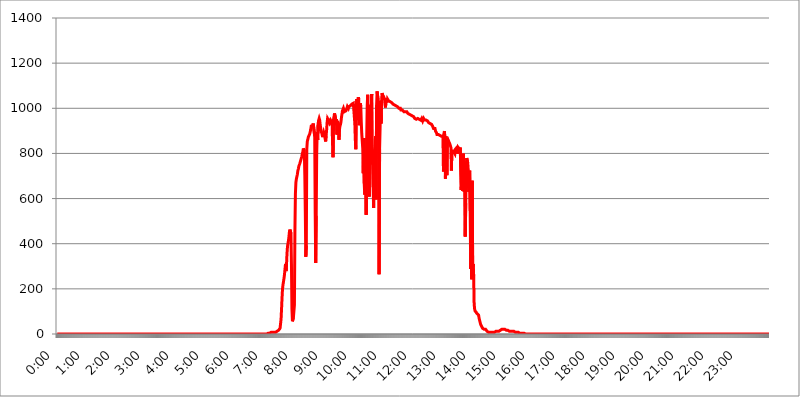
| Category | 2016.12.11. Intenzitás [W/m^2] |
|---|---|
| 0.0 | 0 |
| 0.0006944444444444445 | 0 |
| 0.001388888888888889 | 0 |
| 0.0020833333333333333 | 0 |
| 0.002777777777777778 | 0 |
| 0.003472222222222222 | 0 |
| 0.004166666666666667 | 0 |
| 0.004861111111111111 | 0 |
| 0.005555555555555556 | 0 |
| 0.0062499999999999995 | 0 |
| 0.006944444444444444 | 0 |
| 0.007638888888888889 | 0 |
| 0.008333333333333333 | 0 |
| 0.009027777777777779 | 0 |
| 0.009722222222222222 | 0 |
| 0.010416666666666666 | 0 |
| 0.011111111111111112 | 0 |
| 0.011805555555555555 | 0 |
| 0.012499999999999999 | 0 |
| 0.013194444444444444 | 0 |
| 0.013888888888888888 | 0 |
| 0.014583333333333332 | 0 |
| 0.015277777777777777 | 0 |
| 0.015972222222222224 | 0 |
| 0.016666666666666666 | 0 |
| 0.017361111111111112 | 0 |
| 0.018055555555555557 | 0 |
| 0.01875 | 0 |
| 0.019444444444444445 | 0 |
| 0.02013888888888889 | 0 |
| 0.020833333333333332 | 0 |
| 0.02152777777777778 | 0 |
| 0.022222222222222223 | 0 |
| 0.02291666666666667 | 0 |
| 0.02361111111111111 | 0 |
| 0.024305555555555556 | 0 |
| 0.024999999999999998 | 0 |
| 0.025694444444444447 | 0 |
| 0.02638888888888889 | 0 |
| 0.027083333333333334 | 0 |
| 0.027777777777777776 | 0 |
| 0.02847222222222222 | 0 |
| 0.029166666666666664 | 0 |
| 0.029861111111111113 | 0 |
| 0.030555555555555555 | 0 |
| 0.03125 | 0 |
| 0.03194444444444445 | 0 |
| 0.03263888888888889 | 0 |
| 0.03333333333333333 | 0 |
| 0.034027777777777775 | 0 |
| 0.034722222222222224 | 0 |
| 0.035416666666666666 | 0 |
| 0.036111111111111115 | 0 |
| 0.03680555555555556 | 0 |
| 0.0375 | 0 |
| 0.03819444444444444 | 0 |
| 0.03888888888888889 | 0 |
| 0.03958333333333333 | 0 |
| 0.04027777777777778 | 0 |
| 0.04097222222222222 | 0 |
| 0.041666666666666664 | 0 |
| 0.042361111111111106 | 0 |
| 0.04305555555555556 | 0 |
| 0.043750000000000004 | 0 |
| 0.044444444444444446 | 0 |
| 0.04513888888888889 | 0 |
| 0.04583333333333334 | 0 |
| 0.04652777777777778 | 0 |
| 0.04722222222222222 | 0 |
| 0.04791666666666666 | 0 |
| 0.04861111111111111 | 0 |
| 0.049305555555555554 | 0 |
| 0.049999999999999996 | 0 |
| 0.05069444444444445 | 0 |
| 0.051388888888888894 | 0 |
| 0.052083333333333336 | 0 |
| 0.05277777777777778 | 0 |
| 0.05347222222222222 | 0 |
| 0.05416666666666667 | 0 |
| 0.05486111111111111 | 0 |
| 0.05555555555555555 | 0 |
| 0.05625 | 0 |
| 0.05694444444444444 | 0 |
| 0.057638888888888885 | 0 |
| 0.05833333333333333 | 0 |
| 0.05902777777777778 | 0 |
| 0.059722222222222225 | 0 |
| 0.06041666666666667 | 0 |
| 0.061111111111111116 | 0 |
| 0.06180555555555556 | 0 |
| 0.0625 | 0 |
| 0.06319444444444444 | 0 |
| 0.06388888888888888 | 0 |
| 0.06458333333333334 | 0 |
| 0.06527777777777778 | 0 |
| 0.06597222222222222 | 0 |
| 0.06666666666666667 | 0 |
| 0.06736111111111111 | 0 |
| 0.06805555555555555 | 0 |
| 0.06874999999999999 | 0 |
| 0.06944444444444443 | 0 |
| 0.07013888888888889 | 0 |
| 0.07083333333333333 | 0 |
| 0.07152777777777779 | 0 |
| 0.07222222222222223 | 0 |
| 0.07291666666666667 | 0 |
| 0.07361111111111111 | 0 |
| 0.07430555555555556 | 0 |
| 0.075 | 0 |
| 0.07569444444444444 | 0 |
| 0.0763888888888889 | 0 |
| 0.07708333333333334 | 0 |
| 0.07777777777777778 | 0 |
| 0.07847222222222222 | 0 |
| 0.07916666666666666 | 0 |
| 0.0798611111111111 | 0 |
| 0.08055555555555556 | 0 |
| 0.08125 | 0 |
| 0.08194444444444444 | 0 |
| 0.08263888888888889 | 0 |
| 0.08333333333333333 | 0 |
| 0.08402777777777777 | 0 |
| 0.08472222222222221 | 0 |
| 0.08541666666666665 | 0 |
| 0.08611111111111112 | 0 |
| 0.08680555555555557 | 0 |
| 0.08750000000000001 | 0 |
| 0.08819444444444445 | 0 |
| 0.08888888888888889 | 0 |
| 0.08958333333333333 | 0 |
| 0.09027777777777778 | 0 |
| 0.09097222222222222 | 0 |
| 0.09166666666666667 | 0 |
| 0.09236111111111112 | 0 |
| 0.09305555555555556 | 0 |
| 0.09375 | 0 |
| 0.09444444444444444 | 0 |
| 0.09513888888888888 | 0 |
| 0.09583333333333333 | 0 |
| 0.09652777777777777 | 0 |
| 0.09722222222222222 | 0 |
| 0.09791666666666667 | 0 |
| 0.09861111111111111 | 0 |
| 0.09930555555555555 | 0 |
| 0.09999999999999999 | 0 |
| 0.10069444444444443 | 0 |
| 0.1013888888888889 | 0 |
| 0.10208333333333335 | 0 |
| 0.10277777777777779 | 0 |
| 0.10347222222222223 | 0 |
| 0.10416666666666667 | 0 |
| 0.10486111111111111 | 0 |
| 0.10555555555555556 | 0 |
| 0.10625 | 0 |
| 0.10694444444444444 | 0 |
| 0.1076388888888889 | 0 |
| 0.10833333333333334 | 0 |
| 0.10902777777777778 | 0 |
| 0.10972222222222222 | 0 |
| 0.1111111111111111 | 0 |
| 0.11180555555555556 | 0 |
| 0.11180555555555556 | 0 |
| 0.1125 | 0 |
| 0.11319444444444444 | 0 |
| 0.11388888888888889 | 0 |
| 0.11458333333333333 | 0 |
| 0.11527777777777777 | 0 |
| 0.11597222222222221 | 0 |
| 0.11666666666666665 | 0 |
| 0.1173611111111111 | 0 |
| 0.11805555555555557 | 0 |
| 0.11944444444444445 | 0 |
| 0.12013888888888889 | 0 |
| 0.12083333333333333 | 0 |
| 0.12152777777777778 | 0 |
| 0.12222222222222223 | 0 |
| 0.12291666666666667 | 0 |
| 0.12291666666666667 | 0 |
| 0.12361111111111112 | 0 |
| 0.12430555555555556 | 0 |
| 0.125 | 0 |
| 0.12569444444444444 | 0 |
| 0.12638888888888888 | 0 |
| 0.12708333333333333 | 0 |
| 0.16875 | 0 |
| 0.12847222222222224 | 0 |
| 0.12916666666666668 | 0 |
| 0.12986111111111112 | 0 |
| 0.13055555555555556 | 0 |
| 0.13125 | 0 |
| 0.13194444444444445 | 0 |
| 0.1326388888888889 | 0 |
| 0.13333333333333333 | 0 |
| 0.13402777777777777 | 0 |
| 0.13402777777777777 | 0 |
| 0.13472222222222222 | 0 |
| 0.13541666666666666 | 0 |
| 0.1361111111111111 | 0 |
| 0.13749999999999998 | 0 |
| 0.13819444444444443 | 0 |
| 0.1388888888888889 | 0 |
| 0.13958333333333334 | 0 |
| 0.14027777777777778 | 0 |
| 0.14097222222222222 | 0 |
| 0.14166666666666666 | 0 |
| 0.1423611111111111 | 0 |
| 0.14305555555555557 | 0 |
| 0.14375000000000002 | 0 |
| 0.14444444444444446 | 0 |
| 0.1451388888888889 | 0 |
| 0.1451388888888889 | 0 |
| 0.14652777777777778 | 0 |
| 0.14722222222222223 | 0 |
| 0.14791666666666667 | 0 |
| 0.1486111111111111 | 0 |
| 0.14930555555555555 | 0 |
| 0.15 | 0 |
| 0.15069444444444444 | 0 |
| 0.15138888888888888 | 0 |
| 0.15208333333333332 | 0 |
| 0.15277777777777776 | 0 |
| 0.15347222222222223 | 0 |
| 0.15416666666666667 | 0 |
| 0.15486111111111112 | 0 |
| 0.15555555555555556 | 0 |
| 0.15625 | 0 |
| 0.15694444444444444 | 0 |
| 0.15763888888888888 | 0 |
| 0.15833333333333333 | 0 |
| 0.15902777777777777 | 0 |
| 0.15972222222222224 | 0 |
| 0.16041666666666668 | 0 |
| 0.16111111111111112 | 0 |
| 0.16180555555555556 | 0 |
| 0.1625 | 0 |
| 0.16319444444444445 | 0 |
| 0.1638888888888889 | 0 |
| 0.16458333333333333 | 0 |
| 0.16527777777777777 | 0 |
| 0.16597222222222222 | 0 |
| 0.16666666666666666 | 0 |
| 0.1673611111111111 | 0 |
| 0.16805555555555554 | 0 |
| 0.16874999999999998 | 0 |
| 0.16944444444444443 | 0 |
| 0.17013888888888887 | 0 |
| 0.1708333333333333 | 0 |
| 0.17152777777777775 | 0 |
| 0.17222222222222225 | 0 |
| 0.1729166666666667 | 0 |
| 0.17361111111111113 | 0 |
| 0.17430555555555557 | 0 |
| 0.17500000000000002 | 0 |
| 0.17569444444444446 | 0 |
| 0.1763888888888889 | 0 |
| 0.17708333333333334 | 0 |
| 0.17777777777777778 | 0 |
| 0.17847222222222223 | 0 |
| 0.17916666666666667 | 0 |
| 0.1798611111111111 | 0 |
| 0.18055555555555555 | 0 |
| 0.18125 | 0 |
| 0.18194444444444444 | 0 |
| 0.1826388888888889 | 0 |
| 0.18333333333333335 | 0 |
| 0.1840277777777778 | 0 |
| 0.18472222222222223 | 0 |
| 0.18541666666666667 | 0 |
| 0.18611111111111112 | 0 |
| 0.18680555555555556 | 0 |
| 0.1875 | 0 |
| 0.18819444444444444 | 0 |
| 0.18888888888888888 | 0 |
| 0.18958333333333333 | 0 |
| 0.19027777777777777 | 0 |
| 0.1909722222222222 | 0 |
| 0.19166666666666665 | 0 |
| 0.19236111111111112 | 0 |
| 0.19305555555555554 | 0 |
| 0.19375 | 0 |
| 0.19444444444444445 | 0 |
| 0.1951388888888889 | 0 |
| 0.19583333333333333 | 0 |
| 0.19652777777777777 | 0 |
| 0.19722222222222222 | 0 |
| 0.19791666666666666 | 0 |
| 0.1986111111111111 | 0 |
| 0.19930555555555554 | 0 |
| 0.19999999999999998 | 0 |
| 0.20069444444444443 | 0 |
| 0.20138888888888887 | 0 |
| 0.2020833333333333 | 0 |
| 0.2027777777777778 | 0 |
| 0.2034722222222222 | 0 |
| 0.2041666666666667 | 0 |
| 0.20486111111111113 | 0 |
| 0.20555555555555557 | 0 |
| 0.20625000000000002 | 0 |
| 0.20694444444444446 | 0 |
| 0.2076388888888889 | 0 |
| 0.20833333333333334 | 0 |
| 0.20902777777777778 | 0 |
| 0.20972222222222223 | 0 |
| 0.21041666666666667 | 0 |
| 0.2111111111111111 | 0 |
| 0.21180555555555555 | 0 |
| 0.2125 | 0 |
| 0.21319444444444444 | 0 |
| 0.2138888888888889 | 0 |
| 0.21458333333333335 | 0 |
| 0.2152777777777778 | 0 |
| 0.21597222222222223 | 0 |
| 0.21666666666666667 | 0 |
| 0.21736111111111112 | 0 |
| 0.21805555555555556 | 0 |
| 0.21875 | 0 |
| 0.21944444444444444 | 0 |
| 0.22013888888888888 | 0 |
| 0.22083333333333333 | 0 |
| 0.22152777777777777 | 0 |
| 0.2222222222222222 | 0 |
| 0.22291666666666665 | 0 |
| 0.2236111111111111 | 0 |
| 0.22430555555555556 | 0 |
| 0.225 | 0 |
| 0.22569444444444445 | 0 |
| 0.2263888888888889 | 0 |
| 0.22708333333333333 | 0 |
| 0.22777777777777777 | 0 |
| 0.22847222222222222 | 0 |
| 0.22916666666666666 | 0 |
| 0.2298611111111111 | 0 |
| 0.23055555555555554 | 0 |
| 0.23124999999999998 | 0 |
| 0.23194444444444443 | 0 |
| 0.23263888888888887 | 0 |
| 0.2333333333333333 | 0 |
| 0.2340277777777778 | 0 |
| 0.2347222222222222 | 0 |
| 0.2354166666666667 | 0 |
| 0.23611111111111113 | 0 |
| 0.23680555555555557 | 0 |
| 0.23750000000000002 | 0 |
| 0.23819444444444446 | 0 |
| 0.2388888888888889 | 0 |
| 0.23958333333333334 | 0 |
| 0.24027777777777778 | 0 |
| 0.24097222222222223 | 0 |
| 0.24166666666666667 | 0 |
| 0.2423611111111111 | 0 |
| 0.24305555555555555 | 0 |
| 0.24375 | 0 |
| 0.24444444444444446 | 0 |
| 0.24513888888888888 | 0 |
| 0.24583333333333335 | 0 |
| 0.2465277777777778 | 0 |
| 0.24722222222222223 | 0 |
| 0.24791666666666667 | 0 |
| 0.24861111111111112 | 0 |
| 0.24930555555555556 | 0 |
| 0.25 | 0 |
| 0.25069444444444444 | 0 |
| 0.2513888888888889 | 0 |
| 0.2520833333333333 | 0 |
| 0.25277777777777777 | 0 |
| 0.2534722222222222 | 0 |
| 0.25416666666666665 | 0 |
| 0.2548611111111111 | 0 |
| 0.2555555555555556 | 0 |
| 0.25625000000000003 | 0 |
| 0.2569444444444445 | 0 |
| 0.2576388888888889 | 0 |
| 0.25833333333333336 | 0 |
| 0.2590277777777778 | 0 |
| 0.25972222222222224 | 0 |
| 0.2604166666666667 | 0 |
| 0.2611111111111111 | 0 |
| 0.26180555555555557 | 0 |
| 0.2625 | 0 |
| 0.26319444444444445 | 0 |
| 0.2638888888888889 | 0 |
| 0.26458333333333334 | 0 |
| 0.2652777777777778 | 0 |
| 0.2659722222222222 | 0 |
| 0.26666666666666666 | 0 |
| 0.2673611111111111 | 0 |
| 0.26805555555555555 | 0 |
| 0.26875 | 0 |
| 0.26944444444444443 | 0 |
| 0.2701388888888889 | 0 |
| 0.2708333333333333 | 0 |
| 0.27152777777777776 | 0 |
| 0.2722222222222222 | 0 |
| 0.27291666666666664 | 0 |
| 0.2736111111111111 | 0 |
| 0.2743055555555555 | 0 |
| 0.27499999999999997 | 0 |
| 0.27569444444444446 | 0 |
| 0.27638888888888885 | 0 |
| 0.27708333333333335 | 0 |
| 0.2777777777777778 | 0 |
| 0.27847222222222223 | 0 |
| 0.2791666666666667 | 0 |
| 0.2798611111111111 | 0 |
| 0.28055555555555556 | 0 |
| 0.28125 | 0 |
| 0.28194444444444444 | 0 |
| 0.2826388888888889 | 0 |
| 0.2833333333333333 | 0 |
| 0.28402777777777777 | 0 |
| 0.2847222222222222 | 0 |
| 0.28541666666666665 | 0 |
| 0.28611111111111115 | 0 |
| 0.28680555555555554 | 0 |
| 0.28750000000000003 | 0 |
| 0.2881944444444445 | 0 |
| 0.2888888888888889 | 0 |
| 0.28958333333333336 | 0 |
| 0.2902777777777778 | 0 |
| 0.29097222222222224 | 0 |
| 0.2916666666666667 | 0 |
| 0.2923611111111111 | 0 |
| 0.29305555555555557 | 0 |
| 0.29375 | 0 |
| 0.29444444444444445 | 3.525 |
| 0.2951388888888889 | 3.525 |
| 0.29583333333333334 | 3.525 |
| 0.2965277777777778 | 3.525 |
| 0.2972222222222222 | 3.525 |
| 0.29791666666666666 | 3.525 |
| 0.2986111111111111 | 3.525 |
| 0.29930555555555555 | 7.887 |
| 0.3 | 7.887 |
| 0.30069444444444443 | 7.887 |
| 0.3013888888888889 | 7.887 |
| 0.3020833333333333 | 7.887 |
| 0.30277777777777776 | 7.887 |
| 0.3034722222222222 | 7.887 |
| 0.30416666666666664 | 7.887 |
| 0.3048611111111111 | 7.887 |
| 0.3055555555555555 | 7.887 |
| 0.30624999999999997 | 7.887 |
| 0.3069444444444444 | 12.257 |
| 0.3076388888888889 | 12.257 |
| 0.30833333333333335 | 12.257 |
| 0.3090277777777778 | 12.257 |
| 0.30972222222222223 | 16.636 |
| 0.3104166666666667 | 16.636 |
| 0.3111111111111111 | 21.024 |
| 0.31180555555555556 | 21.024 |
| 0.3125 | 25.419 |
| 0.31319444444444444 | 29.823 |
| 0.3138888888888889 | 65.31 |
| 0.3145833333333333 | 110.201 |
| 0.31527777777777777 | 160.056 |
| 0.3159722222222222 | 201.058 |
| 0.31666666666666665 | 219.309 |
| 0.31736111111111115 | 233 |
| 0.31805555555555554 | 246.689 |
| 0.31875000000000003 | 264.932 |
| 0.3194444444444445 | 287.709 |
| 0.3201388888888889 | 310.44 |
| 0.32083333333333336 | 278.603 |
| 0.3215277777777778 | 305.898 |
| 0.32222222222222224 | 355.712 |
| 0.3229166666666667 | 387.202 |
| 0.3236111111111111 | 400.638 |
| 0.32430555555555557 | 414.035 |
| 0.325 | 431.833 |
| 0.32569444444444445 | 453.968 |
| 0.3263888888888889 | 462.786 |
| 0.32708333333333334 | 458.38 |
| 0.3277777777777778 | 445.129 |
| 0.3284722222222222 | 310.44 |
| 0.32916666666666666 | 110.201 |
| 0.3298611111111111 | 56.398 |
| 0.33055555555555555 | 56.398 |
| 0.33125 | 74.246 |
| 0.33194444444444443 | 74.246 |
| 0.3326388888888889 | 128.284 |
| 0.3333333333333333 | 453.968 |
| 0.3340277777777778 | 621.613 |
| 0.3347222222222222 | 671.22 |
| 0.3354166666666667 | 687.544 |
| 0.3361111111111111 | 683.473 |
| 0.3368055555555556 | 707.8 |
| 0.33749999999999997 | 723.889 |
| 0.33819444444444446 | 731.896 |
| 0.33888888888888885 | 743.859 |
| 0.33958333333333335 | 743.859 |
| 0.34027777777777773 | 755.766 |
| 0.34097222222222223 | 759.723 |
| 0.3416666666666666 | 771.559 |
| 0.3423611111111111 | 775.492 |
| 0.3430555555555555 | 787.258 |
| 0.34375 | 798.974 |
| 0.3444444444444445 | 806.757 |
| 0.3451388888888889 | 822.26 |
| 0.3458333333333334 | 818.392 |
| 0.34652777777777777 | 810.641 |
| 0.34722222222222227 | 703.762 |
| 0.34791666666666665 | 541.121 |
| 0.34861111111111115 | 342.162 |
| 0.34930555555555554 | 391.685 |
| 0.35000000000000003 | 818.392 |
| 0.3506944444444444 | 853.029 |
| 0.3513888888888889 | 860.676 |
| 0.3520833333333333 | 872.114 |
| 0.3527777777777778 | 872.114 |
| 0.3534722222222222 | 875.918 |
| 0.3541666666666667 | 887.309 |
| 0.3548611111111111 | 891.099 |
| 0.35555555555555557 | 906.223 |
| 0.35625 | 921.298 |
| 0.35694444444444445 | 925.06 |
| 0.3576388888888889 | 925.06 |
| 0.35833333333333334 | 925.06 |
| 0.3590277777777778 | 932.576 |
| 0.3597222222222222 | 932.576 |
| 0.36041666666666666 | 928.819 |
| 0.3611111111111111 | 875.918 |
| 0.36180555555555555 | 532.513 |
| 0.3625 | 314.98 |
| 0.36319444444444443 | 523.88 |
| 0.3638888888888889 | 798.974 |
| 0.3645833333333333 | 894.885 |
| 0.3652777777777778 | 860.676 |
| 0.3659722222222222 | 932.576 |
| 0.3666666666666667 | 947.58 |
| 0.3673611111111111 | 955.071 |
| 0.3680555555555556 | 947.58 |
| 0.36874999999999997 | 928.819 |
| 0.36944444444444446 | 913.766 |
| 0.37013888888888885 | 898.668 |
| 0.37083333333333335 | 894.885 |
| 0.37152777777777773 | 883.516 |
| 0.37222222222222223 | 872.114 |
| 0.3729166666666666 | 887.309 |
| 0.3736111111111111 | 894.885 |
| 0.3743055555555555 | 898.668 |
| 0.375 | 879.719 |
| 0.3756944444444445 | 879.719 |
| 0.3763888888888889 | 853.029 |
| 0.3770833333333334 | 879.719 |
| 0.37777777777777777 | 902.447 |
| 0.37847222222222227 | 936.33 |
| 0.37916666666666665 | 955.071 |
| 0.37986111111111115 | 955.071 |
| 0.38055555555555554 | 947.58 |
| 0.38125000000000003 | 947.58 |
| 0.3819444444444444 | 936.33 |
| 0.3826388888888889 | 940.082 |
| 0.3833333333333333 | 947.58 |
| 0.3840277777777778 | 951.327 |
| 0.3847222222222222 | 951.327 |
| 0.3854166666666667 | 936.33 |
| 0.3861111111111111 | 845.365 |
| 0.38680555555555557 | 783.342 |
| 0.3875 | 951.327 |
| 0.38819444444444445 | 962.555 |
| 0.3888888888888889 | 977.508 |
| 0.38958333333333334 | 981.244 |
| 0.3902777777777778 | 955.071 |
| 0.3909722222222222 | 925.06 |
| 0.39166666666666666 | 951.327 |
| 0.3923611111111111 | 883.516 |
| 0.39305555555555555 | 943.832 |
| 0.39375 | 932.576 |
| 0.39444444444444443 | 909.996 |
| 0.3951388888888889 | 860.676 |
| 0.3958333333333333 | 906.223 |
| 0.3965277777777778 | 921.298 |
| 0.3972222222222222 | 928.819 |
| 0.3979166666666667 | 940.082 |
| 0.3986111111111111 | 958.814 |
| 0.3993055555555556 | 973.772 |
| 0.39999999999999997 | 988.714 |
| 0.40069444444444446 | 992.448 |
| 0.40138888888888885 | 999.916 |
| 0.40208333333333335 | 992.448 |
| 0.40277777777777773 | 984.98 |
| 0.40347222222222223 | 981.244 |
| 0.4041666666666666 | 984.98 |
| 0.4048611111111111 | 988.714 |
| 0.4055555555555555 | 992.448 |
| 0.40625 | 999.916 |
| 0.4069444444444445 | 1007.383 |
| 0.4076388888888889 | 1003.65 |
| 0.4083333333333334 | 999.916 |
| 0.40902777777777777 | 1007.383 |
| 0.40972222222222227 | 1007.383 |
| 0.41041666666666665 | 1011.118 |
| 0.41111111111111115 | 1011.118 |
| 0.41180555555555554 | 1014.852 |
| 0.41250000000000003 | 1014.852 |
| 0.4131944444444444 | 1018.587 |
| 0.4138888888888889 | 1018.587 |
| 0.4145833333333333 | 1022.323 |
| 0.4152777777777778 | 1022.323 |
| 0.4159722222222222 | 1022.323 |
| 0.4166666666666667 | 1022.323 |
| 0.4173611111111111 | 932.576 |
| 0.41805555555555557 | 860.676 |
| 0.41875 | 818.392 |
| 0.41944444444444445 | 1011.118 |
| 0.4201388888888889 | 1041.019 |
| 0.42083333333333334 | 1037.277 |
| 0.4215277777777778 | 947.58 |
| 0.4222222222222222 | 1048.508 |
| 0.42291666666666666 | 1041.019 |
| 0.4236111111111111 | 925.06 |
| 0.42430555555555555 | 955.071 |
| 0.425 | 1022.323 |
| 0.42569444444444443 | 1011.118 |
| 0.4263888888888889 | 940.082 |
| 0.4270833333333333 | 887.309 |
| 0.4277777777777778 | 883.516 |
| 0.4284722222222222 | 822.26 |
| 0.4291666666666667 | 711.832 |
| 0.4298611111111111 | 868.305 |
| 0.4305555555555556 | 667.123 |
| 0.43124999999999997 | 617.436 |
| 0.43194444444444446 | 634.105 |
| 0.43263888888888885 | 743.859 |
| 0.43333333333333335 | 528.2 |
| 0.43402777777777773 | 868.305 |
| 0.43472222222222223 | 1011.118 |
| 0.4354166666666666 | 1059.756 |
| 0.4361111111111111 | 818.392 |
| 0.4368055555555555 | 883.516 |
| 0.4375 | 609.062 |
| 0.4381944444444445 | 751.803 |
| 0.4388888888888889 | 955.071 |
| 0.4395833333333334 | 1014.852 |
| 0.44027777777777777 | 984.98 |
| 0.44097222222222227 | 1063.51 |
| 0.44166666666666665 | 751.803 |
| 0.44236111111111115 | 814.519 |
| 0.44305555555555554 | 650.667 |
| 0.44375000000000003 | 558.261 |
| 0.4444444444444444 | 802.868 |
| 0.4451388888888889 | 814.519 |
| 0.4458333333333333 | 833.834 |
| 0.4465277777777778 | 875.918 |
| 0.4472222222222222 | 596.45 |
| 0.4479166666666667 | 1014.852 |
| 0.4486111111111111 | 1074.789 |
| 0.44930555555555557 | 1071.027 |
| 0.45 | 1037.277 |
| 0.45069444444444445 | 932.576 |
| 0.4513888888888889 | 264.932 |
| 0.45208333333333334 | 818.392 |
| 0.4527777777777778 | 909.996 |
| 0.4534722222222222 | 1033.537 |
| 0.45416666666666666 | 932.576 |
| 0.4548611111111111 | 1029.798 |
| 0.45555555555555555 | 1067.267 |
| 0.45625 | 1059.756 |
| 0.45694444444444443 | 1056.004 |
| 0.4576388888888889 | 1052.255 |
| 0.4583333333333333 | 1052.255 |
| 0.4590277777777778 | 1041.019 |
| 0.4597222222222222 | 1014.852 |
| 0.4604166666666667 | 1003.65 |
| 0.4611111111111111 | 1044.762 |
| 0.4618055555555556 | 1044.762 |
| 0.46249999999999997 | 1026.06 |
| 0.46319444444444446 | 1041.019 |
| 0.46388888888888885 | 1037.277 |
| 0.46458333333333335 | 1033.537 |
| 0.46527777777777773 | 1029.798 |
| 0.46597222222222223 | 1029.798 |
| 0.4666666666666666 | 1029.798 |
| 0.4673611111111111 | 1029.798 |
| 0.4680555555555555 | 1029.798 |
| 0.46875 | 1026.06 |
| 0.4694444444444445 | 1026.06 |
| 0.4701388888888889 | 1022.323 |
| 0.4708333333333334 | 1018.587 |
| 0.47152777777777777 | 1018.587 |
| 0.47222222222222227 | 1014.852 |
| 0.47291666666666665 | 1014.852 |
| 0.47361111111111115 | 1011.118 |
| 0.47430555555555554 | 1011.118 |
| 0.47500000000000003 | 1011.118 |
| 0.4756944444444444 | 1011.118 |
| 0.4763888888888889 | 1007.383 |
| 0.4770833333333333 | 1007.383 |
| 0.4777777777777778 | 1007.383 |
| 0.4784722222222222 | 1003.65 |
| 0.4791666666666667 | 999.916 |
| 0.4798611111111111 | 999.916 |
| 0.48055555555555557 | 999.916 |
| 0.48125 | 999.916 |
| 0.48194444444444445 | 992.448 |
| 0.4826388888888889 | 992.448 |
| 0.48333333333333334 | 996.182 |
| 0.4840277777777778 | 992.448 |
| 0.4847222222222222 | 992.448 |
| 0.48541666666666666 | 988.714 |
| 0.4861111111111111 | 984.98 |
| 0.48680555555555555 | 988.714 |
| 0.4875 | 988.714 |
| 0.48819444444444443 | 984.98 |
| 0.4888888888888889 | 984.98 |
| 0.4895833333333333 | 984.98 |
| 0.4902777777777778 | 984.98 |
| 0.4909722222222222 | 981.244 |
| 0.4916666666666667 | 977.508 |
| 0.4923611111111111 | 977.508 |
| 0.4930555555555556 | 973.772 |
| 0.49374999999999997 | 973.772 |
| 0.49444444444444446 | 970.034 |
| 0.49513888888888885 | 973.772 |
| 0.49583333333333335 | 970.034 |
| 0.49652777777777773 | 970.034 |
| 0.49722222222222223 | 970.034 |
| 0.4979166666666666 | 966.295 |
| 0.4986111111111111 | 966.295 |
| 0.4993055555555555 | 962.555 |
| 0.5 | 962.555 |
| 0.5006944444444444 | 958.814 |
| 0.5013888888888889 | 955.071 |
| 0.5020833333333333 | 951.327 |
| 0.5027777777777778 | 951.327 |
| 0.5034722222222222 | 951.327 |
| 0.5041666666666667 | 947.58 |
| 0.5048611111111111 | 947.58 |
| 0.5055555555555555 | 955.071 |
| 0.50625 | 951.327 |
| 0.5069444444444444 | 955.071 |
| 0.5076388888888889 | 951.327 |
| 0.5083333333333333 | 951.327 |
| 0.5090277777777777 | 947.58 |
| 0.5097222222222222 | 947.58 |
| 0.5104166666666666 | 951.327 |
| 0.5111111111111112 | 955.071 |
| 0.5118055555555555 | 951.327 |
| 0.5125000000000001 | 943.832 |
| 0.5131944444444444 | 943.832 |
| 0.513888888888889 | 955.071 |
| 0.5145833333333333 | 955.071 |
| 0.5152777777777778 | 947.58 |
| 0.5159722222222222 | 943.832 |
| 0.5166666666666667 | 943.832 |
| 0.517361111111111 | 947.58 |
| 0.5180555555555556 | 947.58 |
| 0.5187499999999999 | 947.58 |
| 0.5194444444444445 | 943.832 |
| 0.5201388888888888 | 940.082 |
| 0.5208333333333334 | 936.33 |
| 0.5215277777777778 | 936.33 |
| 0.5222222222222223 | 936.33 |
| 0.5229166666666667 | 932.576 |
| 0.5236111111111111 | 932.576 |
| 0.5243055555555556 | 928.819 |
| 0.525 | 928.819 |
| 0.5256944444444445 | 925.06 |
| 0.5263888888888889 | 921.298 |
| 0.5270833333333333 | 917.534 |
| 0.5277777777777778 | 909.996 |
| 0.5284722222222222 | 906.223 |
| 0.5291666666666667 | 913.766 |
| 0.5298611111111111 | 909.996 |
| 0.5305555555555556 | 898.668 |
| 0.53125 | 902.447 |
| 0.5319444444444444 | 891.099 |
| 0.5326388888888889 | 883.516 |
| 0.5333333333333333 | 879.719 |
| 0.5340277777777778 | 879.719 |
| 0.5347222222222222 | 883.516 |
| 0.5354166666666667 | 883.516 |
| 0.5361111111111111 | 883.516 |
| 0.5368055555555555 | 879.719 |
| 0.5375 | 879.719 |
| 0.5381944444444444 | 875.918 |
| 0.5388888888888889 | 875.918 |
| 0.5395833333333333 | 875.918 |
| 0.5402777777777777 | 872.114 |
| 0.5409722222222222 | 875.918 |
| 0.5416666666666666 | 719.877 |
| 0.5423611111111112 | 887.309 |
| 0.5430555555555555 | 898.668 |
| 0.5437500000000001 | 860.676 |
| 0.5444444444444444 | 687.544 |
| 0.545138888888889 | 875.918 |
| 0.5458333333333333 | 826.123 |
| 0.5465277777777778 | 703.762 |
| 0.5472222222222222 | 868.305 |
| 0.5479166666666667 | 849.199 |
| 0.548611111111111 | 856.855 |
| 0.5493055555555556 | 853.029 |
| 0.5499999999999999 | 856.855 |
| 0.5506944444444445 | 841.526 |
| 0.5513888888888888 | 833.834 |
| 0.5520833333333334 | 826.123 |
| 0.5527777777777778 | 723.889 |
| 0.5534722222222223 | 810.641 |
| 0.5541666666666667 | 814.519 |
| 0.5548611111111111 | 814.519 |
| 0.5555555555555556 | 810.641 |
| 0.55625 | 814.519 |
| 0.5569444444444445 | 806.757 |
| 0.5576388888888889 | 798.974 |
| 0.5583333333333333 | 818.392 |
| 0.5590277777777778 | 822.26 |
| 0.5597222222222222 | 818.392 |
| 0.5604166666666667 | 826.123 |
| 0.5611111111111111 | 829.981 |
| 0.5618055555555556 | 798.974 |
| 0.5625 | 826.123 |
| 0.5631944444444444 | 826.123 |
| 0.5638888888888889 | 822.26 |
| 0.5645833333333333 | 818.392 |
| 0.5652777777777778 | 826.123 |
| 0.5659722222222222 | 829.981 |
| 0.5666666666666667 | 638.256 |
| 0.5673611111111111 | 711.832 |
| 0.5680555555555555 | 727.896 |
| 0.56875 | 634.105 |
| 0.5694444444444444 | 798.974 |
| 0.5701388888888889 | 798.974 |
| 0.5708333333333333 | 629.948 |
| 0.5715277777777777 | 759.723 |
| 0.5722222222222222 | 431.833 |
| 0.5729166666666666 | 579.542 |
| 0.5736111111111112 | 743.859 |
| 0.5743055555555555 | 779.42 |
| 0.5750000000000001 | 779.42 |
| 0.5756944444444444 | 759.723 |
| 0.576388888888889 | 727.896 |
| 0.5770833333333333 | 629.948 |
| 0.5777777777777778 | 695.666 |
| 0.5784722222222222 | 723.889 |
| 0.5791666666666667 | 545.416 |
| 0.579861111111111 | 287.709 |
| 0.5805555555555556 | 364.728 |
| 0.5812499999999999 | 242.127 |
| 0.5819444444444445 | 679.395 |
| 0.5826388888888888 | 296.808 |
| 0.5833333333333334 | 310.44 |
| 0.5840277777777778 | 260.373 |
| 0.5847222222222223 | 132.814 |
| 0.5854166666666667 | 110.201 |
| 0.5861111111111111 | 101.184 |
| 0.5868055555555556 | 101.184 |
| 0.5875 | 96.682 |
| 0.5881944444444445 | 92.184 |
| 0.5888888888888889 | 92.184 |
| 0.5895833333333333 | 87.692 |
| 0.5902777777777778 | 87.692 |
| 0.5909722222222222 | 83.205 |
| 0.5916666666666667 | 69.775 |
| 0.5923611111111111 | 60.85 |
| 0.5930555555555556 | 51.951 |
| 0.59375 | 43.079 |
| 0.5944444444444444 | 38.653 |
| 0.5951388888888889 | 34.234 |
| 0.5958333333333333 | 29.823 |
| 0.5965277777777778 | 25.419 |
| 0.5972222222222222 | 21.024 |
| 0.5979166666666667 | 21.024 |
| 0.5986111111111111 | 21.024 |
| 0.5993055555555555 | 25.419 |
| 0.6 | 21.024 |
| 0.6006944444444444 | 21.024 |
| 0.6013888888888889 | 16.636 |
| 0.6020833333333333 | 16.636 |
| 0.6027777777777777 | 12.257 |
| 0.6034722222222222 | 12.257 |
| 0.6041666666666666 | 12.257 |
| 0.6048611111111112 | 7.887 |
| 0.6055555555555555 | 7.887 |
| 0.6062500000000001 | 7.887 |
| 0.6069444444444444 | 7.887 |
| 0.607638888888889 | 7.887 |
| 0.6083333333333333 | 7.887 |
| 0.6090277777777778 | 7.887 |
| 0.6097222222222222 | 7.887 |
| 0.6104166666666667 | 7.887 |
| 0.611111111111111 | 7.887 |
| 0.6118055555555556 | 7.887 |
| 0.6124999999999999 | 7.887 |
| 0.6131944444444445 | 7.887 |
| 0.6138888888888888 | 12.257 |
| 0.6145833333333334 | 12.257 |
| 0.6152777777777778 | 12.257 |
| 0.6159722222222223 | 12.257 |
| 0.6166666666666667 | 12.257 |
| 0.6173611111111111 | 12.257 |
| 0.6180555555555556 | 12.257 |
| 0.61875 | 12.257 |
| 0.6194444444444445 | 12.257 |
| 0.6201388888888889 | 12.257 |
| 0.6208333333333333 | 12.257 |
| 0.6215277777777778 | 16.636 |
| 0.6222222222222222 | 16.636 |
| 0.6229166666666667 | 21.024 |
| 0.6236111111111111 | 21.024 |
| 0.6243055555555556 | 21.024 |
| 0.625 | 21.024 |
| 0.6256944444444444 | 21.024 |
| 0.6263888888888889 | 21.024 |
| 0.6270833333333333 | 21.024 |
| 0.6277777777777778 | 21.024 |
| 0.6284722222222222 | 21.024 |
| 0.6291666666666667 | 21.024 |
| 0.6298611111111111 | 16.636 |
| 0.6305555555555555 | 16.636 |
| 0.63125 | 16.636 |
| 0.6319444444444444 | 16.636 |
| 0.6326388888888889 | 12.257 |
| 0.6333333333333333 | 12.257 |
| 0.6340277777777777 | 12.257 |
| 0.6347222222222222 | 12.257 |
| 0.6354166666666666 | 12.257 |
| 0.6361111111111112 | 12.257 |
| 0.6368055555555555 | 12.257 |
| 0.6375000000000001 | 12.257 |
| 0.6381944444444444 | 12.257 |
| 0.638888888888889 | 12.257 |
| 0.6395833333333333 | 12.257 |
| 0.6402777777777778 | 12.257 |
| 0.6409722222222222 | 7.887 |
| 0.6416666666666667 | 7.887 |
| 0.642361111111111 | 7.887 |
| 0.6430555555555556 | 7.887 |
| 0.6437499999999999 | 7.887 |
| 0.6444444444444445 | 7.887 |
| 0.6451388888888888 | 7.887 |
| 0.6458333333333334 | 7.887 |
| 0.6465277777777778 | 7.887 |
| 0.6472222222222223 | 3.525 |
| 0.6479166666666667 | 3.525 |
| 0.6486111111111111 | 3.525 |
| 0.6493055555555556 | 3.525 |
| 0.65 | 3.525 |
| 0.6506944444444445 | 3.525 |
| 0.6513888888888889 | 3.525 |
| 0.6520833333333333 | 3.525 |
| 0.6527777777777778 | 3.525 |
| 0.6534722222222222 | 3.525 |
| 0.6541666666666667 | 3.525 |
| 0.6548611111111111 | 3.525 |
| 0.6555555555555556 | 0 |
| 0.65625 | 0 |
| 0.6569444444444444 | 0 |
| 0.6576388888888889 | 0 |
| 0.6583333333333333 | 0 |
| 0.6590277777777778 | 0 |
| 0.6597222222222222 | 0 |
| 0.6604166666666667 | 0 |
| 0.6611111111111111 | 0 |
| 0.6618055555555555 | 0 |
| 0.6625 | 0 |
| 0.6631944444444444 | 0 |
| 0.6638888888888889 | 0 |
| 0.6645833333333333 | 0 |
| 0.6652777777777777 | 0 |
| 0.6659722222222222 | 0 |
| 0.6666666666666666 | 0 |
| 0.6673611111111111 | 0 |
| 0.6680555555555556 | 0 |
| 0.6687500000000001 | 0 |
| 0.6694444444444444 | 0 |
| 0.6701388888888888 | 0 |
| 0.6708333333333334 | 0 |
| 0.6715277777777778 | 0 |
| 0.6722222222222222 | 0 |
| 0.6729166666666666 | 0 |
| 0.6736111111111112 | 0 |
| 0.6743055555555556 | 0 |
| 0.6749999999999999 | 0 |
| 0.6756944444444444 | 0 |
| 0.6763888888888889 | 0 |
| 0.6770833333333334 | 0 |
| 0.6777777777777777 | 0 |
| 0.6784722222222223 | 0 |
| 0.6791666666666667 | 0 |
| 0.6798611111111111 | 0 |
| 0.6805555555555555 | 0 |
| 0.68125 | 0 |
| 0.6819444444444445 | 0 |
| 0.6826388888888889 | 0 |
| 0.6833333333333332 | 0 |
| 0.6840277777777778 | 0 |
| 0.6847222222222222 | 0 |
| 0.6854166666666667 | 0 |
| 0.686111111111111 | 0 |
| 0.6868055555555556 | 0 |
| 0.6875 | 0 |
| 0.6881944444444444 | 0 |
| 0.688888888888889 | 0 |
| 0.6895833333333333 | 0 |
| 0.6902777777777778 | 0 |
| 0.6909722222222222 | 0 |
| 0.6916666666666668 | 0 |
| 0.6923611111111111 | 0 |
| 0.6930555555555555 | 0 |
| 0.69375 | 0 |
| 0.6944444444444445 | 0 |
| 0.6951388888888889 | 0 |
| 0.6958333333333333 | 0 |
| 0.6965277777777777 | 0 |
| 0.6972222222222223 | 0 |
| 0.6979166666666666 | 0 |
| 0.6986111111111111 | 0 |
| 0.6993055555555556 | 0 |
| 0.7000000000000001 | 0 |
| 0.7006944444444444 | 0 |
| 0.7013888888888888 | 0 |
| 0.7020833333333334 | 0 |
| 0.7027777777777778 | 0 |
| 0.7034722222222222 | 0 |
| 0.7041666666666666 | 0 |
| 0.7048611111111112 | 0 |
| 0.7055555555555556 | 0 |
| 0.7062499999999999 | 0 |
| 0.7069444444444444 | 0 |
| 0.7076388888888889 | 0 |
| 0.7083333333333334 | 0 |
| 0.7090277777777777 | 0 |
| 0.7097222222222223 | 0 |
| 0.7104166666666667 | 0 |
| 0.7111111111111111 | 0 |
| 0.7118055555555555 | 0 |
| 0.7125 | 0 |
| 0.7131944444444445 | 0 |
| 0.7138888888888889 | 0 |
| 0.7145833333333332 | 0 |
| 0.7152777777777778 | 0 |
| 0.7159722222222222 | 0 |
| 0.7166666666666667 | 0 |
| 0.717361111111111 | 0 |
| 0.7180555555555556 | 0 |
| 0.71875 | 0 |
| 0.7194444444444444 | 0 |
| 0.720138888888889 | 0 |
| 0.7208333333333333 | 0 |
| 0.7215277777777778 | 0 |
| 0.7222222222222222 | 0 |
| 0.7229166666666668 | 0 |
| 0.7236111111111111 | 0 |
| 0.7243055555555555 | 0 |
| 0.725 | 0 |
| 0.7256944444444445 | 0 |
| 0.7263888888888889 | 0 |
| 0.7270833333333333 | 0 |
| 0.7277777777777777 | 0 |
| 0.7284722222222223 | 0 |
| 0.7291666666666666 | 0 |
| 0.7298611111111111 | 0 |
| 0.7305555555555556 | 0 |
| 0.7312500000000001 | 0 |
| 0.7319444444444444 | 0 |
| 0.7326388888888888 | 0 |
| 0.7333333333333334 | 0 |
| 0.7340277777777778 | 0 |
| 0.7347222222222222 | 0 |
| 0.7354166666666666 | 0 |
| 0.7361111111111112 | 0 |
| 0.7368055555555556 | 0 |
| 0.7374999999999999 | 0 |
| 0.7381944444444444 | 0 |
| 0.7388888888888889 | 0 |
| 0.7395833333333334 | 0 |
| 0.7402777777777777 | 0 |
| 0.7409722222222223 | 0 |
| 0.7416666666666667 | 0 |
| 0.7423611111111111 | 0 |
| 0.7430555555555555 | 0 |
| 0.74375 | 0 |
| 0.7444444444444445 | 0 |
| 0.7451388888888889 | 0 |
| 0.7458333333333332 | 0 |
| 0.7465277777777778 | 0 |
| 0.7472222222222222 | 0 |
| 0.7479166666666667 | 0 |
| 0.748611111111111 | 0 |
| 0.7493055555555556 | 0 |
| 0.75 | 0 |
| 0.7506944444444444 | 0 |
| 0.751388888888889 | 0 |
| 0.7520833333333333 | 0 |
| 0.7527777777777778 | 0 |
| 0.7534722222222222 | 0 |
| 0.7541666666666668 | 0 |
| 0.7548611111111111 | 0 |
| 0.7555555555555555 | 0 |
| 0.75625 | 0 |
| 0.7569444444444445 | 0 |
| 0.7576388888888889 | 0 |
| 0.7583333333333333 | 0 |
| 0.7590277777777777 | 0 |
| 0.7597222222222223 | 0 |
| 0.7604166666666666 | 0 |
| 0.7611111111111111 | 0 |
| 0.7618055555555556 | 0 |
| 0.7625000000000001 | 0 |
| 0.7631944444444444 | 0 |
| 0.7638888888888888 | 0 |
| 0.7645833333333334 | 0 |
| 0.7652777777777778 | 0 |
| 0.7659722222222222 | 0 |
| 0.7666666666666666 | 0 |
| 0.7673611111111112 | 0 |
| 0.7680555555555556 | 0 |
| 0.7687499999999999 | 0 |
| 0.7694444444444444 | 0 |
| 0.7701388888888889 | 0 |
| 0.7708333333333334 | 0 |
| 0.7715277777777777 | 0 |
| 0.7722222222222223 | 0 |
| 0.7729166666666667 | 0 |
| 0.7736111111111111 | 0 |
| 0.7743055555555555 | 0 |
| 0.775 | 0 |
| 0.7756944444444445 | 0 |
| 0.7763888888888889 | 0 |
| 0.7770833333333332 | 0 |
| 0.7777777777777778 | 0 |
| 0.7784722222222222 | 0 |
| 0.7791666666666667 | 0 |
| 0.779861111111111 | 0 |
| 0.7805555555555556 | 0 |
| 0.78125 | 0 |
| 0.7819444444444444 | 0 |
| 0.782638888888889 | 0 |
| 0.7833333333333333 | 0 |
| 0.7840277777777778 | 0 |
| 0.7847222222222222 | 0 |
| 0.7854166666666668 | 0 |
| 0.7861111111111111 | 0 |
| 0.7868055555555555 | 0 |
| 0.7875 | 0 |
| 0.7881944444444445 | 0 |
| 0.7888888888888889 | 0 |
| 0.7895833333333333 | 0 |
| 0.7902777777777777 | 0 |
| 0.7909722222222223 | 0 |
| 0.7916666666666666 | 0 |
| 0.7923611111111111 | 0 |
| 0.7930555555555556 | 0 |
| 0.7937500000000001 | 0 |
| 0.7944444444444444 | 0 |
| 0.7951388888888888 | 0 |
| 0.7958333333333334 | 0 |
| 0.7965277777777778 | 0 |
| 0.7972222222222222 | 0 |
| 0.7979166666666666 | 0 |
| 0.7986111111111112 | 0 |
| 0.7993055555555556 | 0 |
| 0.7999999999999999 | 0 |
| 0.8006944444444444 | 0 |
| 0.8013888888888889 | 0 |
| 0.8020833333333334 | 0 |
| 0.8027777777777777 | 0 |
| 0.8034722222222223 | 0 |
| 0.8041666666666667 | 0 |
| 0.8048611111111111 | 0 |
| 0.8055555555555555 | 0 |
| 0.80625 | 0 |
| 0.8069444444444445 | 0 |
| 0.8076388888888889 | 0 |
| 0.8083333333333332 | 0 |
| 0.8090277777777778 | 0 |
| 0.8097222222222222 | 0 |
| 0.8104166666666667 | 0 |
| 0.811111111111111 | 0 |
| 0.8118055555555556 | 0 |
| 0.8125 | 0 |
| 0.8131944444444444 | 0 |
| 0.813888888888889 | 0 |
| 0.8145833333333333 | 0 |
| 0.8152777777777778 | 0 |
| 0.8159722222222222 | 0 |
| 0.8166666666666668 | 0 |
| 0.8173611111111111 | 0 |
| 0.8180555555555555 | 0 |
| 0.81875 | 0 |
| 0.8194444444444445 | 0 |
| 0.8201388888888889 | 0 |
| 0.8208333333333333 | 0 |
| 0.8215277777777777 | 0 |
| 0.8222222222222223 | 0 |
| 0.8229166666666666 | 0 |
| 0.8236111111111111 | 0 |
| 0.8243055555555556 | 0 |
| 0.8250000000000001 | 0 |
| 0.8256944444444444 | 0 |
| 0.8263888888888888 | 0 |
| 0.8270833333333334 | 0 |
| 0.8277777777777778 | 0 |
| 0.8284722222222222 | 0 |
| 0.8291666666666666 | 0 |
| 0.8298611111111112 | 0 |
| 0.8305555555555556 | 0 |
| 0.8312499999999999 | 0 |
| 0.8319444444444444 | 0 |
| 0.8326388888888889 | 0 |
| 0.8333333333333334 | 0 |
| 0.8340277777777777 | 0 |
| 0.8347222222222223 | 0 |
| 0.8354166666666667 | 0 |
| 0.8361111111111111 | 0 |
| 0.8368055555555555 | 0 |
| 0.8375 | 0 |
| 0.8381944444444445 | 0 |
| 0.8388888888888889 | 0 |
| 0.8395833333333332 | 0 |
| 0.8402777777777778 | 0 |
| 0.8409722222222222 | 0 |
| 0.8416666666666667 | 0 |
| 0.842361111111111 | 0 |
| 0.8430555555555556 | 0 |
| 0.84375 | 0 |
| 0.8444444444444444 | 0 |
| 0.845138888888889 | 0 |
| 0.8458333333333333 | 0 |
| 0.8465277777777778 | 0 |
| 0.8472222222222222 | 0 |
| 0.8479166666666668 | 0 |
| 0.8486111111111111 | 0 |
| 0.8493055555555555 | 0 |
| 0.85 | 0 |
| 0.8506944444444445 | 0 |
| 0.8513888888888889 | 0 |
| 0.8520833333333333 | 0 |
| 0.8527777777777777 | 0 |
| 0.8534722222222223 | 0 |
| 0.8541666666666666 | 0 |
| 0.8548611111111111 | 0 |
| 0.8555555555555556 | 0 |
| 0.8562500000000001 | 0 |
| 0.8569444444444444 | 0 |
| 0.8576388888888888 | 0 |
| 0.8583333333333334 | 0 |
| 0.8590277777777778 | 0 |
| 0.8597222222222222 | 0 |
| 0.8604166666666666 | 0 |
| 0.8611111111111112 | 0 |
| 0.8618055555555556 | 0 |
| 0.8624999999999999 | 0 |
| 0.8631944444444444 | 0 |
| 0.8638888888888889 | 0 |
| 0.8645833333333334 | 0 |
| 0.8652777777777777 | 0 |
| 0.8659722222222223 | 0 |
| 0.8666666666666667 | 0 |
| 0.8673611111111111 | 0 |
| 0.8680555555555555 | 0 |
| 0.86875 | 0 |
| 0.8694444444444445 | 0 |
| 0.8701388888888889 | 0 |
| 0.8708333333333332 | 0 |
| 0.8715277777777778 | 0 |
| 0.8722222222222222 | 0 |
| 0.8729166666666667 | 0 |
| 0.873611111111111 | 0 |
| 0.8743055555555556 | 0 |
| 0.875 | 0 |
| 0.8756944444444444 | 0 |
| 0.876388888888889 | 0 |
| 0.8770833333333333 | 0 |
| 0.8777777777777778 | 0 |
| 0.8784722222222222 | 0 |
| 0.8791666666666668 | 0 |
| 0.8798611111111111 | 0 |
| 0.8805555555555555 | 0 |
| 0.88125 | 0 |
| 0.8819444444444445 | 0 |
| 0.8826388888888889 | 0 |
| 0.8833333333333333 | 0 |
| 0.8840277777777777 | 0 |
| 0.8847222222222223 | 0 |
| 0.8854166666666666 | 0 |
| 0.8861111111111111 | 0 |
| 0.8868055555555556 | 0 |
| 0.8875000000000001 | 0 |
| 0.8881944444444444 | 0 |
| 0.8888888888888888 | 0 |
| 0.8895833333333334 | 0 |
| 0.8902777777777778 | 0 |
| 0.8909722222222222 | 0 |
| 0.8916666666666666 | 0 |
| 0.8923611111111112 | 0 |
| 0.8930555555555556 | 0 |
| 0.8937499999999999 | 0 |
| 0.8944444444444444 | 0 |
| 0.8951388888888889 | 0 |
| 0.8958333333333334 | 0 |
| 0.8965277777777777 | 0 |
| 0.8972222222222223 | 0 |
| 0.8979166666666667 | 0 |
| 0.8986111111111111 | 0 |
| 0.8993055555555555 | 0 |
| 0.9 | 0 |
| 0.9006944444444445 | 0 |
| 0.9013888888888889 | 0 |
| 0.9020833333333332 | 0 |
| 0.9027777777777778 | 0 |
| 0.9034722222222222 | 0 |
| 0.9041666666666667 | 0 |
| 0.904861111111111 | 0 |
| 0.9055555555555556 | 0 |
| 0.90625 | 0 |
| 0.9069444444444444 | 0 |
| 0.907638888888889 | 0 |
| 0.9083333333333333 | 0 |
| 0.9090277777777778 | 0 |
| 0.9097222222222222 | 0 |
| 0.9104166666666668 | 0 |
| 0.9111111111111111 | 0 |
| 0.9118055555555555 | 0 |
| 0.9125 | 0 |
| 0.9131944444444445 | 0 |
| 0.9138888888888889 | 0 |
| 0.9145833333333333 | 0 |
| 0.9152777777777777 | 0 |
| 0.9159722222222223 | 0 |
| 0.9166666666666666 | 0 |
| 0.9173611111111111 | 0 |
| 0.9180555555555556 | 0 |
| 0.9187500000000001 | 0 |
| 0.9194444444444444 | 0 |
| 0.9201388888888888 | 0 |
| 0.9208333333333334 | 0 |
| 0.9215277777777778 | 0 |
| 0.9222222222222222 | 0 |
| 0.9229166666666666 | 0 |
| 0.9236111111111112 | 0 |
| 0.9243055555555556 | 0 |
| 0.9249999999999999 | 0 |
| 0.9256944444444444 | 0 |
| 0.9263888888888889 | 0 |
| 0.9270833333333334 | 0 |
| 0.9277777777777777 | 0 |
| 0.9284722222222223 | 0 |
| 0.9291666666666667 | 0 |
| 0.9298611111111111 | 0 |
| 0.9305555555555555 | 0 |
| 0.93125 | 0 |
| 0.9319444444444445 | 0 |
| 0.9326388888888889 | 0 |
| 0.9333333333333332 | 0 |
| 0.9340277777777778 | 0 |
| 0.9347222222222222 | 0 |
| 0.9354166666666667 | 0 |
| 0.936111111111111 | 0 |
| 0.9368055555555556 | 0 |
| 0.9375 | 0 |
| 0.9381944444444444 | 0 |
| 0.938888888888889 | 0 |
| 0.9395833333333333 | 0 |
| 0.9402777777777778 | 0 |
| 0.9409722222222222 | 0 |
| 0.9416666666666668 | 0 |
| 0.9423611111111111 | 0 |
| 0.9430555555555555 | 0 |
| 0.94375 | 0 |
| 0.9444444444444445 | 0 |
| 0.9451388888888889 | 0 |
| 0.9458333333333333 | 0 |
| 0.9465277777777777 | 0 |
| 0.9472222222222223 | 0 |
| 0.9479166666666666 | 0 |
| 0.9486111111111111 | 0 |
| 0.9493055555555556 | 0 |
| 0.9500000000000001 | 0 |
| 0.9506944444444444 | 0 |
| 0.9513888888888888 | 0 |
| 0.9520833333333334 | 0 |
| 0.9527777777777778 | 0 |
| 0.9534722222222222 | 0 |
| 0.9541666666666666 | 0 |
| 0.9548611111111112 | 0 |
| 0.9555555555555556 | 0 |
| 0.9562499999999999 | 0 |
| 0.9569444444444444 | 0 |
| 0.9576388888888889 | 0 |
| 0.9583333333333334 | 0 |
| 0.9590277777777777 | 0 |
| 0.9597222222222223 | 0 |
| 0.9604166666666667 | 0 |
| 0.9611111111111111 | 0 |
| 0.9618055555555555 | 0 |
| 0.9625 | 0 |
| 0.9631944444444445 | 0 |
| 0.9638888888888889 | 0 |
| 0.9645833333333332 | 0 |
| 0.9652777777777778 | 0 |
| 0.9659722222222222 | 0 |
| 0.9666666666666667 | 0 |
| 0.967361111111111 | 0 |
| 0.9680555555555556 | 0 |
| 0.96875 | 0 |
| 0.9694444444444444 | 0 |
| 0.970138888888889 | 0 |
| 0.9708333333333333 | 0 |
| 0.9715277777777778 | 0 |
| 0.9722222222222222 | 0 |
| 0.9729166666666668 | 0 |
| 0.9736111111111111 | 0 |
| 0.9743055555555555 | 0 |
| 0.975 | 0 |
| 0.9756944444444445 | 0 |
| 0.9763888888888889 | 0 |
| 0.9770833333333333 | 0 |
| 0.9777777777777777 | 0 |
| 0.9784722222222223 | 0 |
| 0.9791666666666666 | 0 |
| 0.9798611111111111 | 0 |
| 0.9805555555555556 | 0 |
| 0.9812500000000001 | 0 |
| 0.9819444444444444 | 0 |
| 0.9826388888888888 | 0 |
| 0.9833333333333334 | 0 |
| 0.9840277777777778 | 0 |
| 0.9847222222222222 | 0 |
| 0.9854166666666666 | 0 |
| 0.9861111111111112 | 0 |
| 0.9868055555555556 | 0 |
| 0.9874999999999999 | 0 |
| 0.9881944444444444 | 0 |
| 0.9888888888888889 | 0 |
| 0.9895833333333334 | 0 |
| 0.9902777777777777 | 0 |
| 0.9909722222222223 | 0 |
| 0.9916666666666667 | 0 |
| 0.9923611111111111 | 0 |
| 0.9930555555555555 | 0 |
| 0.99375 | 0 |
| 0.9944444444444445 | 0 |
| 0.9951388888888889 | 0 |
| 0.9958333333333332 | 0 |
| 0.9965277777777778 | 0 |
| 0.9972222222222222 | 0 |
| 0.9979166666666667 | 0 |
| 0.998611111111111 | 0 |
| 0.9993055555555556 | 0 |